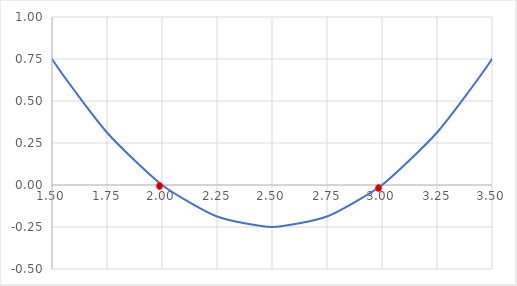
| Category | Series 0 |
|---|---|
| 0.0 | 6 |
| 0.25 | 4.812 |
| 0.5 | 3.75 |
| 0.75 | 2.812 |
| 1.0 | 2 |
| 1.25 | 1.312 |
| 1.5 | 0.75 |
| 1.75 | 0.312 |
| 2.0 | 0 |
| 2.25 | -0.188 |
| 2.5 | -0.25 |
| 2.75 | -0.188 |
| 3.0 | 0 |
| 3.25 | 0.312 |
| 3.5 | 0.75 |
| 3.75 | 1.312 |
| 4.0 | 2 |